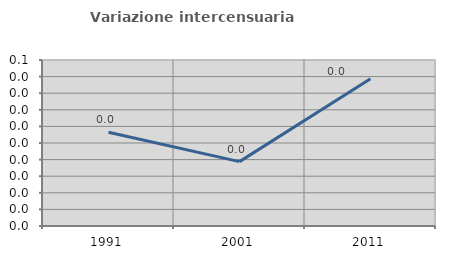
| Category | Variazione intercensuaria annua |
|---|---|
| 1991.0 | 0.028 |
| 2001.0 | 0.019 |
| 2011.0 | 0.044 |